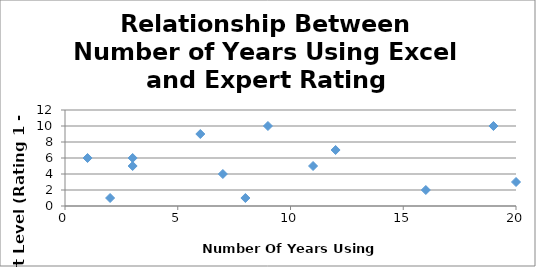
| Category | Expert Level (Rating 1 - 10)) |
|---|---|
| 3.0 | 5 |
| 8.0 | 1 |
| 6.0 | 9 |
| 11.0 | 5 |
| 20.0 | 3 |
| 7.0 | 4 |
| 9.0 | 10 |
| 3.0 | 6 |
| 19.0 | 10 |
| 2.0 | 1 |
| 16.0 | 2 |
| 12.0 | 7 |
| 1.0 | 6 |